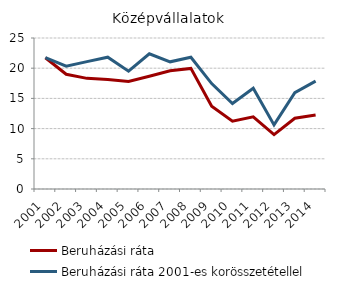
| Category | Beruházási ráta | Beruházási ráta 2001-es korösszetétellel |
|---|---|---|
| 2001.0 | 21.738 | 21.738 |
| 2002.0 | 18.998 | 20.344 |
| 2003.0 | 18.319 | 21.089 |
| 2004.0 | 18.115 | 21.822 |
| 2005.0 | 17.794 | 19.502 |
| 2006.0 | 18.676 | 22.381 |
| 2007.0 | 19.561 | 21.056 |
| 2008.0 | 19.969 | 21.821 |
| 2009.0 | 13.707 | 17.454 |
| 2010.0 | 11.228 | 14.158 |
| 2011.0 | 11.948 | 16.691 |
| 2012.0 | 9.012 | 10.609 |
| 2013.0 | 11.721 | 15.944 |
| 2014.0 | 12.257 | 17.869 |